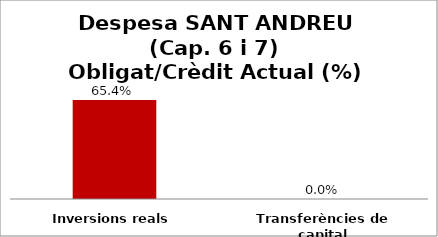
| Category | Series 0 |
|---|---|
| Inversions reals | 0.654 |
| Transferències de capital | 0 |